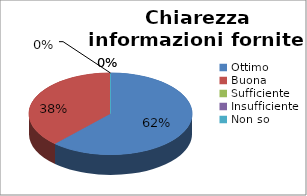
| Category | Chiarezza informazioni fornite |
|---|---|
| Ottimo | 13 |
| Buona | 8 |
| Sufficiente | 0 |
| Insufficiente | 0 |
| Non so | 0 |